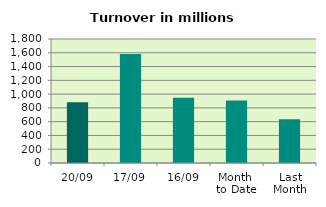
| Category | Series 0 |
|---|---|
| 20/09 | 881.914 |
| 17/09 | 1582.616 |
| 16/09 | 945.433 |
| Month 
to Date | 905.606 |
| Last
Month | 635.477 |